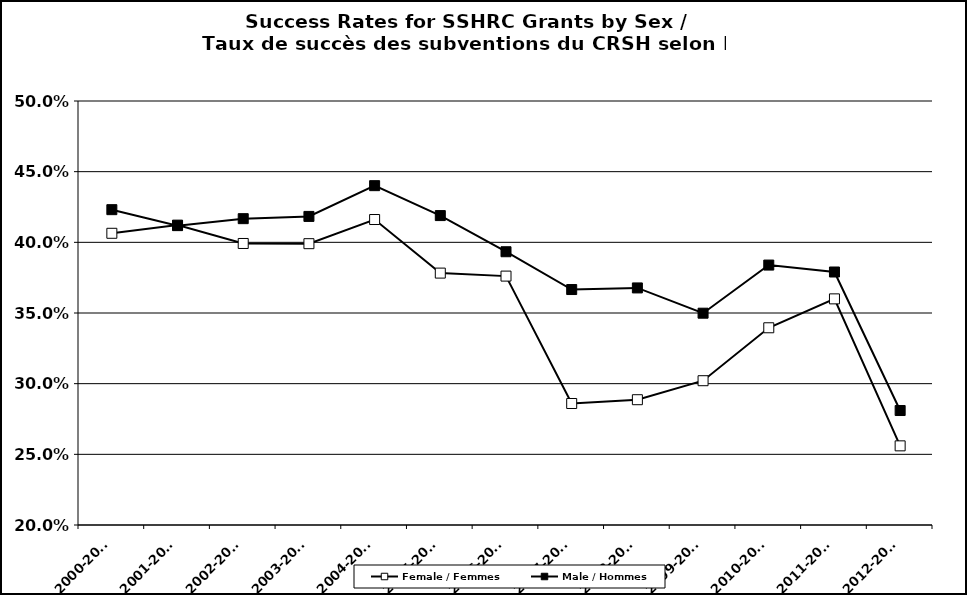
| Category | Female / Femmes | Male / Hommes |
|---|---|---|
| 2000-2001 | 0.406 | 0.423 |
| 2001-2002 | 0.412 | 0.412 |
| 2002-2003 | 0.399 | 0.417 |
| 2003-2004 | 0.399 | 0.418 |
| 2004-2005 | 0.416 | 0.44 |
| 2005-2006 | 0.378 | 0.419 |
| 2006-2007 | 0.376 | 0.393 |
| 2007-2008 | 0.286 | 0.367 |
| 2008-2009 | 0.289 | 0.368 |
| 2009-2010 | 0.302 | 0.35 |
| 2010-2011 | 0.34 | 0.384 |
| 2011-2012 | 0.36 | 0.379 |
| 2012-2013 | 0.256 | 0.281 |